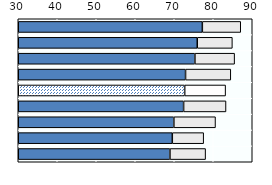
| Category | Series 1 | Series 0 |
|---|---|---|
| 0 | 77.2 | 9.85 |
| 1 | 75.9 | 9 |
| 2 | 75.3 | 10.18 |
| 3 | 72.9 | 11.6 |
| 4 | 72.68 | 10.486 |
| 5 | 72.4 | 10.87 |
| 6 | 69.9 | 10.677 |
| 7 | 69.5 | 8.047 |
| 8 | 68.9 | 9.137 |